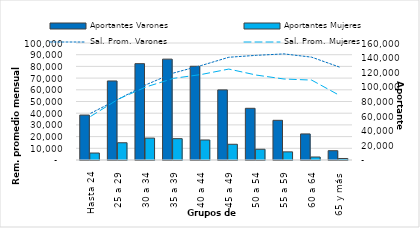
| Category | Aportantes Varones | Aportantes Mujeres |
|---|---|---|
| Hasta 24 | 61450 | 9537 |
| 25 a 29 | 108079 | 23579 |
| 30 a 34 | 131733 | 29937 |
| 35 a 39 | 137941 | 29178 |
| 40 a 44 | 128180 | 27379 |
| 45 a 49 | 95865 | 21512 |
| 50 a 54 | 70696 | 14684 |
| 55 a 59 | 54271 | 11123 |
| 60 a 64 | 35642 | 4088 |
| 65 y más | 12715 | 2056 |